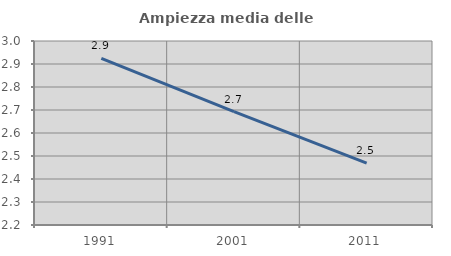
| Category | Ampiezza media delle famiglie |
|---|---|
| 1991.0 | 2.924 |
| 2001.0 | 2.693 |
| 2011.0 | 2.469 |